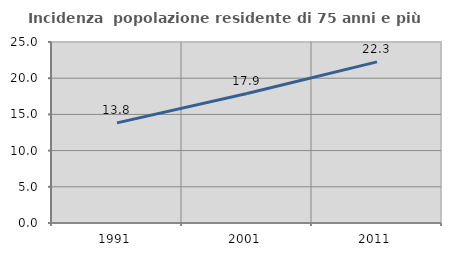
| Category | Incidenza  popolazione residente di 75 anni e più |
|---|---|
| 1991.0 | 13.826 |
| 2001.0 | 17.876 |
| 2011.0 | 22.255 |